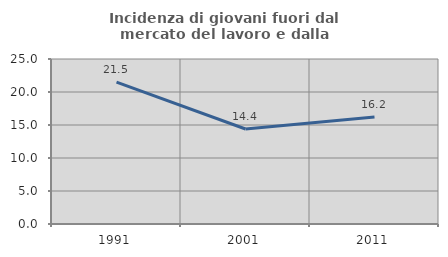
| Category | Incidenza di giovani fuori dal mercato del lavoro e dalla formazione  |
|---|---|
| 1991.0 | 21.509 |
| 2001.0 | 14.391 |
| 2011.0 | 16.204 |